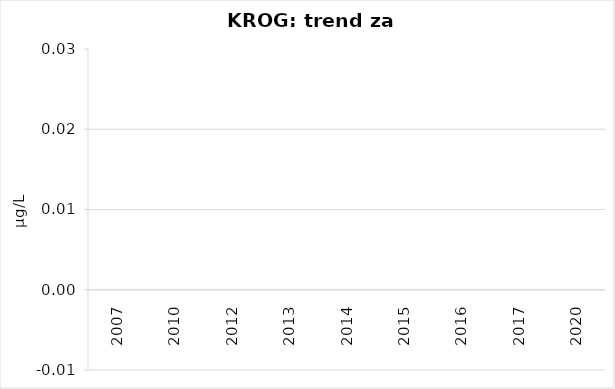
| Category | Vsota |
|---|---|
| 2007 | 0 |
| 2010 | 0 |
| 2012 | 0 |
| 2013 | 0 |
| 2014 | 0 |
| 2015 | 0 |
| 2016 | 0 |
| 2017 | 0 |
| 2020 | 0 |